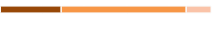
| Category | Series 0 | Series 1 | Series 2 |
|---|---|---|---|
| 0 | 0.289 | 0.593 | 0.119 |